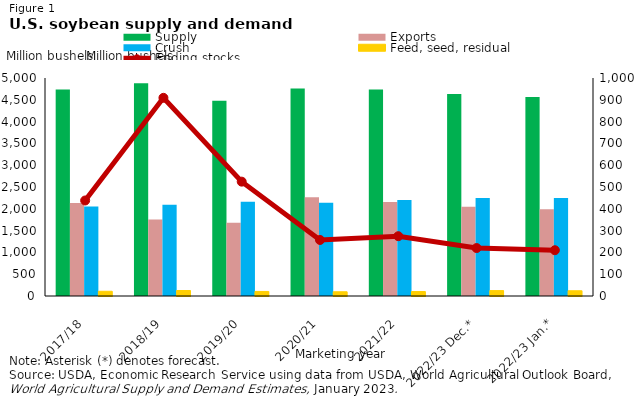
| Category | Supply | Exports | Crush | Feed, seed, residual |
|---|---|---|---|---|
| 2017/18 | 4735.039 | 2133.731 | 2054.932 | 108.271 |
| 2018/19 | 4880.312 | 1753.43 | 2091.99 | 125.84 |
| 2019/20 | 4476.341 | 1682.875 | 2164.554 | 104.37 |
| 2020/21 | 4760.658 | 2265.804 | 2140.585 | 97.29 |
| 2021/22 | 4738.271 | 2157.63 | 2203.814 | 102.433 |
| 2022/23 Dec.* | 4634.28 | 2045 | 2245 | 124.1 |
| 2022/23 Jan.* | 4565.517 | 1990 | 2245 | 120.353 |